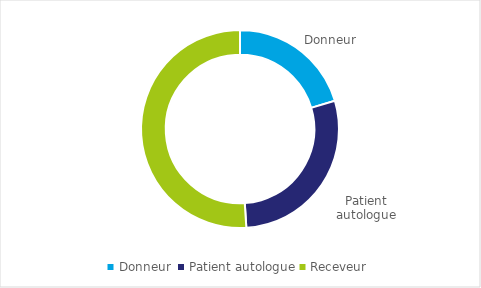
| Category | Series 0 |
|---|---|
| Donneur  | 10 |
| Patient autologue | 14 |
| Receveur | 25 |